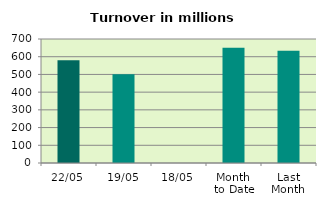
| Category | Series 0 |
|---|---|
| 22/05 | 580.206 |
| 19/05 | 501.582 |
| 18/05 | 0 |
| Month 
to Date | 650.186 |
| Last
Month | 634.312 |